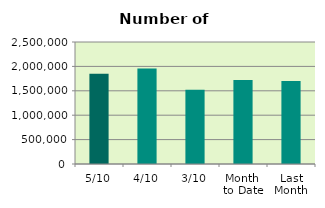
| Category | Series 0 |
|---|---|
| 5/10 | 1850852 |
| 4/10 | 1959300 |
| 3/10 | 1523418 |
| Month 
to Date | 1719622.4 |
| Last
Month | 1700207.9 |